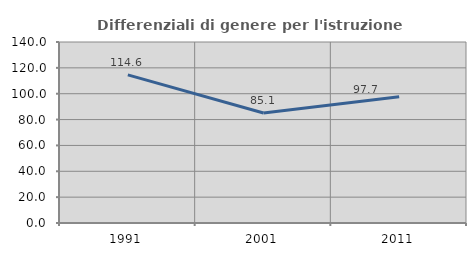
| Category | Differenziali di genere per l'istruzione superiore |
|---|---|
| 1991.0 | 114.551 |
| 2001.0 | 85.06 |
| 2011.0 | 97.721 |